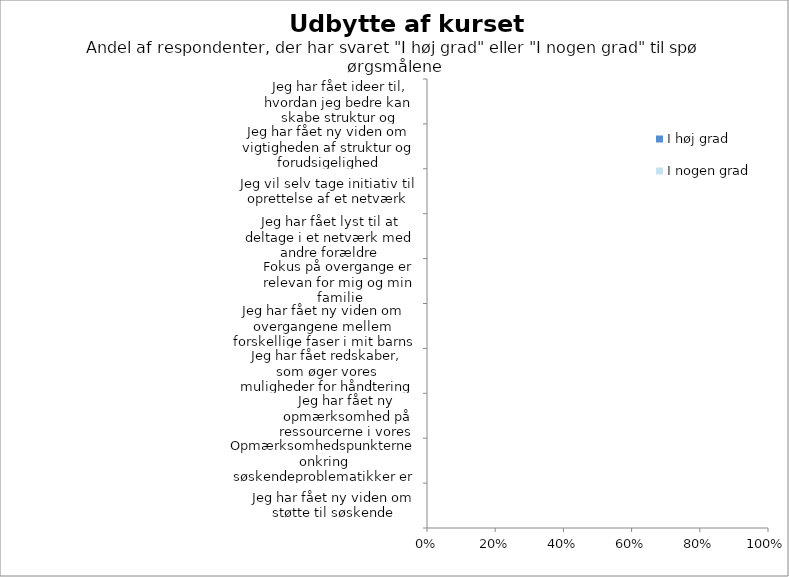
| Category | I høj grad | I nogen grad |
|---|---|---|
| Jeg har fået ny viden om støtte til søskende | 0 | 0 |
| Opmærksomhedspunkterne onkring søskendeproblematikker er relevante i min familie | 0 | 0 |
| Jeg har fået ny opmærksomhed på ressourcerne i vores familie | 0 | 0 |
| Jeg har fået redskaber, som øger vores muligheder for håndtering i familien | 0 | 0 |
| Jeg har fået ny viden om overgangene mellem forskellige faser i mit barns liv | 0 | 0 |
| Fokus på overgange er relevan for mig og min familie | 0 | 0 |
| Jeg har fået lyst til at deltage i et netværk med andre forældre | 0 | 0 |
| Jeg vil selv tage initiativ til oprettelse af et netværk | 0 | 0 |
| Jeg har fået ny viden om vigtigheden af struktur og forudsigelighed | 0 | 0 |
| Jeg har fået ideer til, hvordan jeg bedre kan skabe struktur og forudsigelighed i vores familie | 0 | 0 |